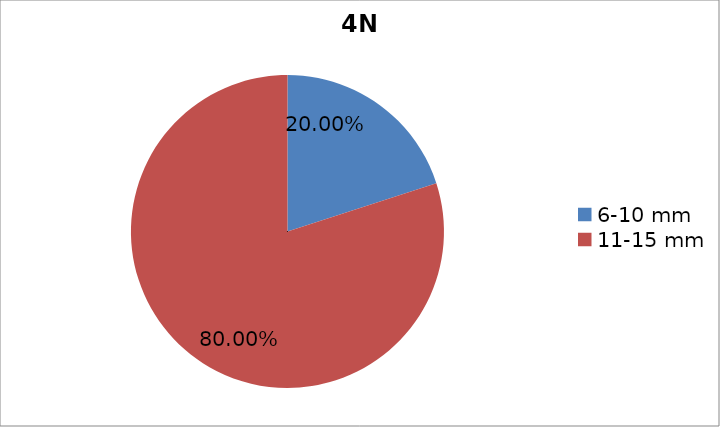
| Category | Series 0 |
|---|---|
| 6-10 mm | 0.2 |
| 11-15 mm | 0.8 |